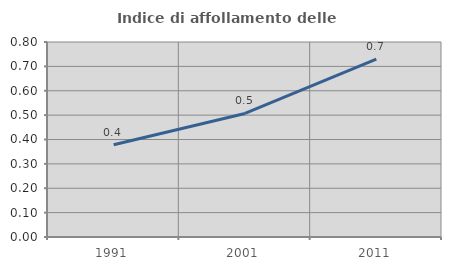
| Category | Indice di affollamento delle abitazioni  |
|---|---|
| 1991.0 | 0.379 |
| 2001.0 | 0.507 |
| 2011.0 | 0.729 |